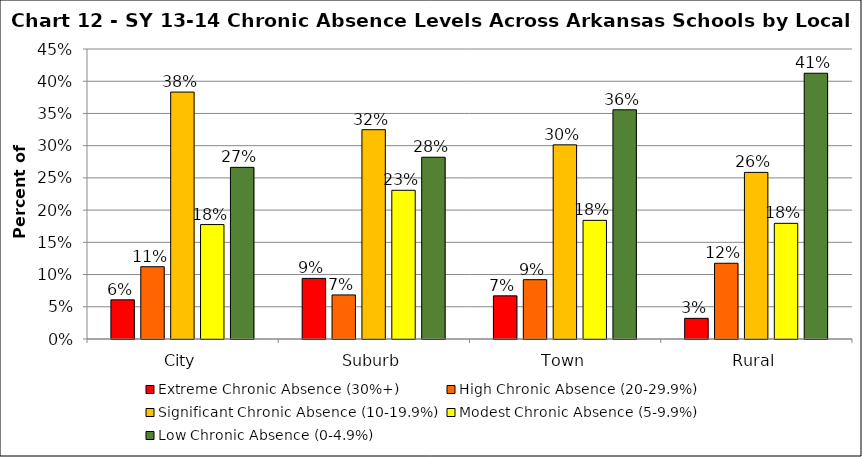
| Category | Extreme Chronic Absence (30%+) | High Chronic Absence (20-29.9%) | Significant Chronic Absence (10-19.9%) | Modest Chronic Absence (5-9.9%) | Low Chronic Absence (0-4.9%) |
|---|---|---|---|---|---|
| 0 | 0.061 | 0.112 | 0.383 | 0.178 | 0.266 |
| 1 | 0.094 | 0.068 | 0.325 | 0.231 | 0.282 |
| 2 | 0.067 | 0.092 | 0.301 | 0.184 | 0.356 |
| 3 | 0.032 | 0.118 | 0.259 | 0.179 | 0.412 |